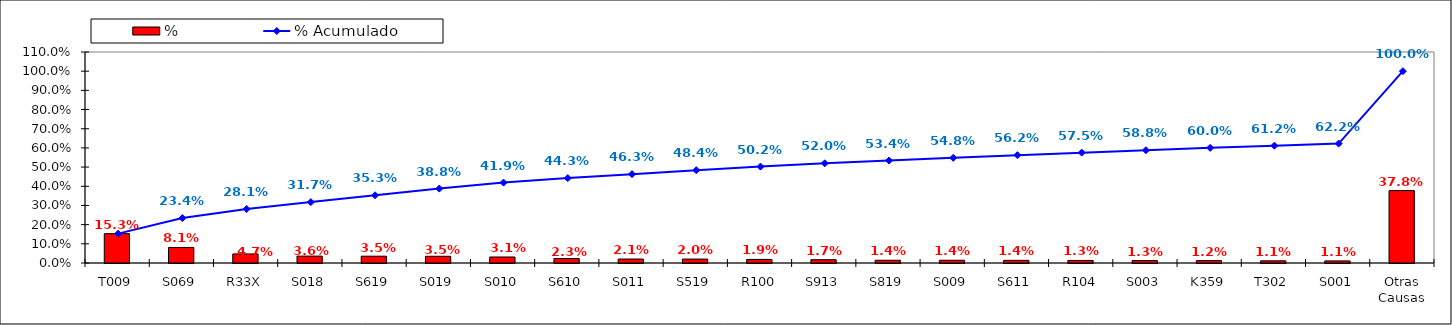
| Category | % |
|---|---|
| T009 | 0.153 |
| S069 | 0.081 |
| R33X | 0.047 |
| S018 | 0.036 |
| S619 | 0.035 |
| S019 | 0.035 |
| S010 | 0.031 |
| S610 | 0.023 |
| S011 | 0.021 |
| S519 | 0.02 |
| R100 | 0.019 |
| S913 | 0.017 |
| S819 | 0.014 |
| S009 | 0.014 |
| S611 | 0.014 |
| R104 | 0.013 |
| S003 | 0.013 |
| K359 | 0.012 |
| T302 | 0.011 |
| S001 | 0.011 |
| Otras Causas | 0.378 |